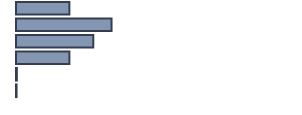
| Category | Series 0 |
|---|---|
| 0 | 19 |
| 1 | 34 |
| 2 | 27.5 |
| 3 | 19 |
| 4 | 0.3 |
| 5 | 0.2 |